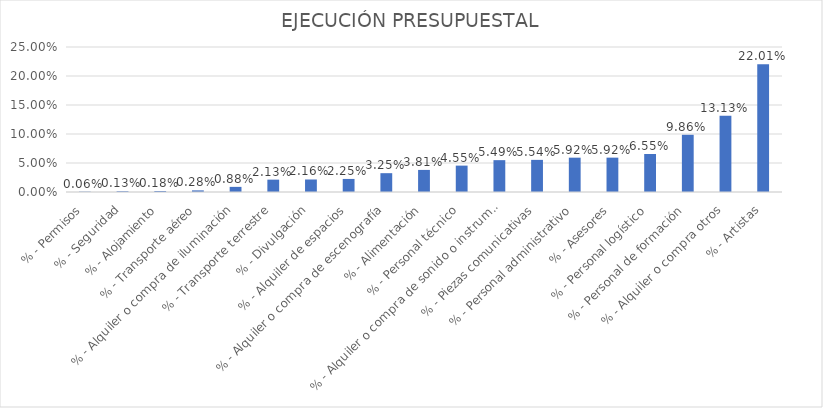
| Category | % |
|---|---|
| % - Permisos | 0.001 |
| % - Seguridad | 0.001 |
| % - Alojamiento | 0.002 |
| % - Transporte aéreo | 0.003 |
| % - Alquiler o compra de iluminación | 0.009 |
| % - Transporte terrestre | 0.021 |
| % - Divulgación | 0.022 |
| % - Alquiler de espacios | 0.023 |
| % - Alquiler o compra de escenografía | 0.032 |
| % - Alimentación | 0.038 |
| % - Personal técnico | 0.045 |
| % - Alquiler o compra de sonido o instrumentos | 0.055 |
| % - Piezas comunicativas | 0.055 |
| % - Personal administrativo | 0.059 |
| % - Asesores | 0.059 |
| % - Personal logístico | 0.066 |
| % - Personal de formación | 0.099 |
| % - Alquiler o compra otros | 0.131 |
| % - Artistas | 0.22 |